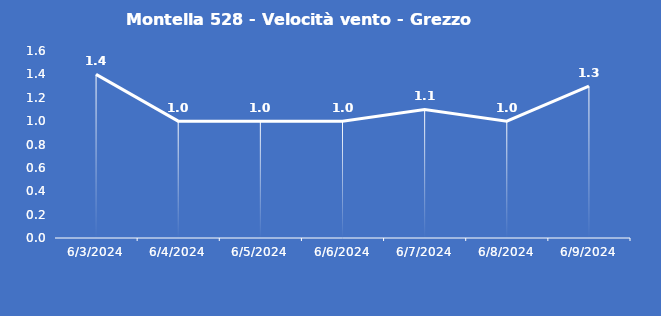
| Category | Montella 528 - Velocità vento - Grezzo (m/s) |
|---|---|
| 6/3/24 | 1.4 |
| 6/4/24 | 1 |
| 6/5/24 | 1 |
| 6/6/24 | 1 |
| 6/7/24 | 1.1 |
| 6/8/24 | 1 |
| 6/9/24 | 1.3 |